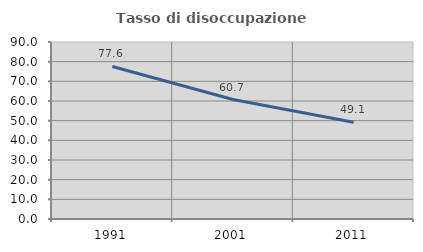
| Category | Tasso di disoccupazione giovanile  |
|---|---|
| 1991.0 | 77.573 |
| 2001.0 | 60.736 |
| 2011.0 | 49.148 |